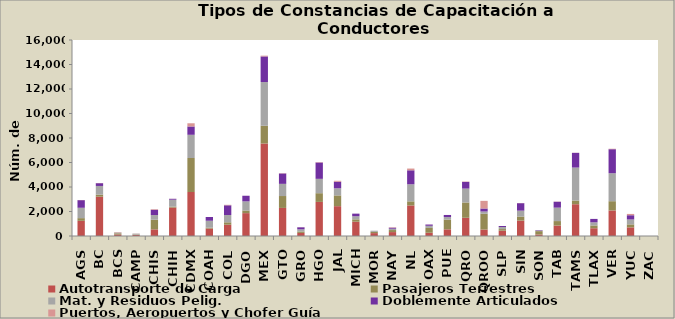
| Category | Autotransporte de Carga | Pasajeros Terrestres | Mat. y Residuos Pelig. | Doblemente Articulados | Puertos, Aeropuertos y Chofer Guía |
|---|---|---|---|---|---|
| AGS | 1238 | 221 | 845 | 623 | 12 |
| BC | 3211 | 165 | 709 | 228 | 15 |
| BCS | 127 | 93 | 68 | 0 | 34 |
| CAMP | 87 | 34 | 72 | 0 | 11 |
| CHIS | 542 | 785 | 383 | 431 | 47 |
| CHIH | 2322 | 74 | 568 | 72 | 7 |
| CDMX | 3591 | 2775 | 1896 | 679 | 261 |
| COAH | 607 | 69 | 570 | 306 | 0 |
| COL | 922 | 196 | 595 | 793 | 39 |
| DGO | 1867 | 215 | 744 | 459 | 4 |
| MEX | 7551 | 1447 | 3567 | 2094 | 62 |
| GTO | 2292 | 971 | 994 | 848 | 23 |
| GRO | 253 | 117 | 173 | 168 | 8 |
| HGO | 2783 | 711 | 1172 | 1335 | 30 |
| JAL | 2436 | 878 | 580 | 536 | 76 |
| MICH | 1166 | 193 | 252 | 214 | 3 |
| MOR | 236 | 102 | 95 | 0 | 0 |
| NAY | 320 | 167 | 108 | 84 | 32 |
| NL | 2496 | 333 | 1391 | 1144 | 142 |
| OAX | 266 | 395 | 172 | 104 | 5 |
| PUE | 545 | 798 | 201 | 173 | 1 |
| QRO | 1487 | 1251 | 1133 | 547 | 26 |
| QROO | 527 | 1286 | 186 | 247 | 623 |
| SLP | 435 | 131 | 167 | 83 | 1 |
| SIN | 1257 | 332 | 481 | 610 | 13 |
| SON | 124 | 275 | 53 | 33 | 0 |
| TAB | 854 | 365 | 1096 | 481 | 16 |
| TAMS | 2594 | 301 | 2691 | 1201 | 9 |
| TLAX | 634 | 226 | 257 | 278 | 1 |
| VER | 2085 | 756 | 2282 | 1963 | 36 |
| YUC | 705 | 244 | 400 | 346 | 107 |
| ZAC | 0 | 0 | 0 | 0 | 0 |